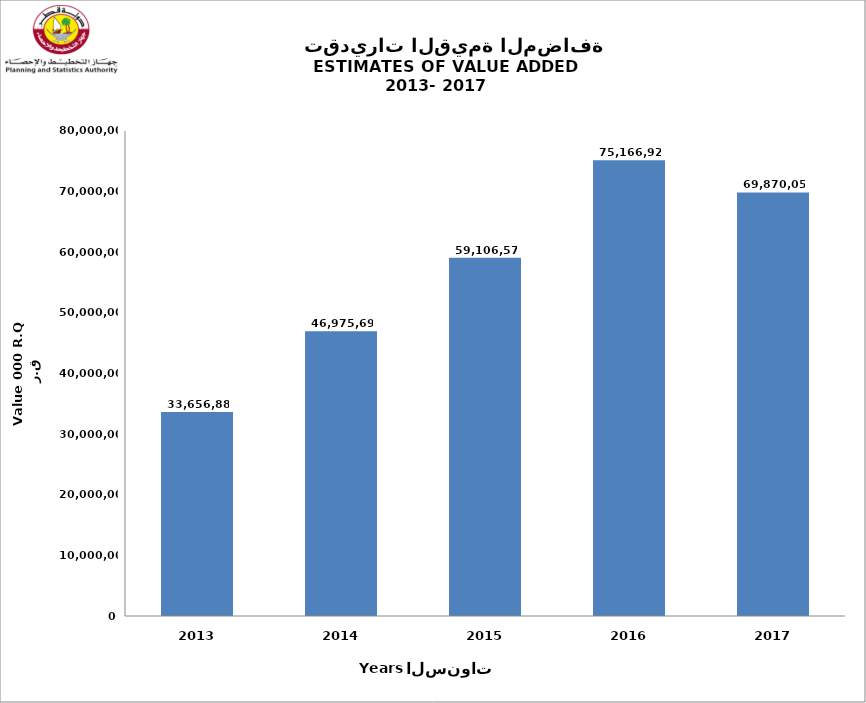
| Category | السنة
Year |
|---|---|
| 2017.0 | 69870056 |
| 2016.0 | 75166929 |
| 2015.0 | 59106571 |
| 2014.0 | 46975693 |
| 2013.0 | 33656880 |